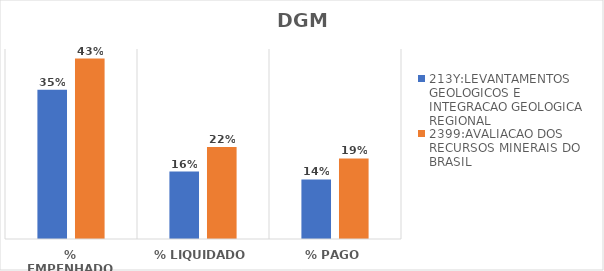
| Category | 213Y:LEVANTAMENTOS GEOLOGICOS E INTEGRACAO GEOLOGICA REGIONAL | 2399:AVALIACAO DOS RECURSOS MINERAIS DO BRASIL |
|---|---|---|
| % EMPENHADO | 0.354 | 0.427 |
| % LIQUIDADO | 0.16 | 0.218 |
| % PAGO | 0.141 | 0.191 |